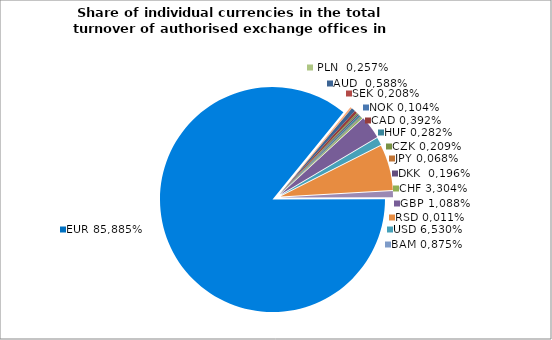
| Category | AUD |
|---|---|
| 0 | 0.006 |
| 1 | 0.004 |
| 2 | 0.002 |
| 3 | 0.002 |
| 4 | 0.003 |
| 5 | 0.001 |
| 6 | 0.001 |
| 7 | 0 |
| 8 | 0.002 |
| 9 | 0.033 |
| 10 | 0.011 |
| 11 | 0.065 |
| 12 | 0 |
| 13 | 0 |
| 14 | 0 |
| 15 | 0.009 |
| 16 | 0.859 |
| 17 | 0.003 |